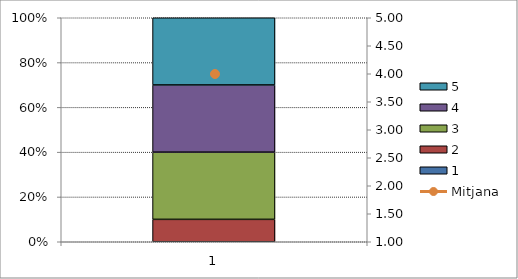
| Category | 1 | 2 | 3 | 4 | 5 |
|---|---|---|---|---|---|
| 0 | 0 | 1 | 3 | 3 | 3 |